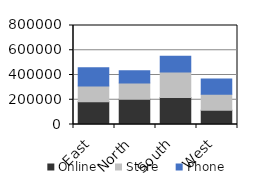
| Category | Online | Store | Phone |
|---|---|---|---|
| East | 183127 | 128043 | 146858 |
| North | 204076 | 132249 | 98239 |
| South | 219182 | 204397 | 126966 |
| West | 115989 | 129426 | 123049 |